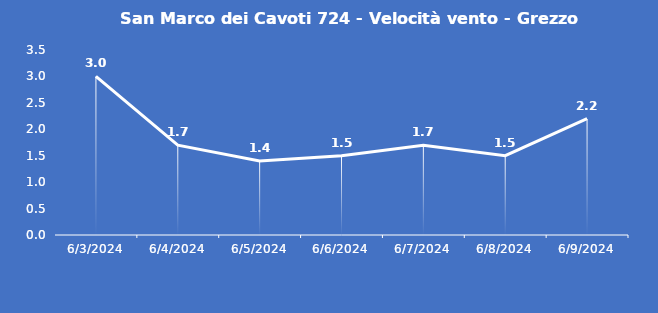
| Category | San Marco dei Cavoti 724 - Velocità vento - Grezzo (m/s) |
|---|---|
| 6/3/24 | 3 |
| 6/4/24 | 1.7 |
| 6/5/24 | 1.4 |
| 6/6/24 | 1.5 |
| 6/7/24 | 1.7 |
| 6/8/24 | 1.5 |
| 6/9/24 | 2.2 |